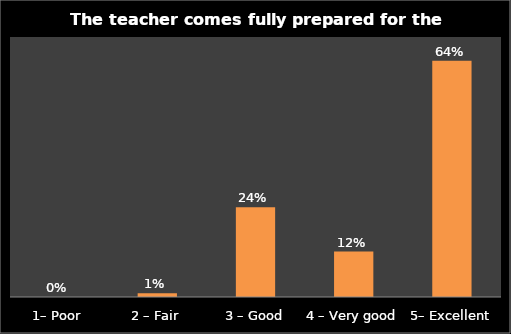
| Category | Series 0 |
|---|---|
| 1– Poor | 0 |
| 2 – Fair | 0.01 |
| 3 – Good | 0.241 |
| 4 – Very good | 0.122 |
| 5– Excellent | 0.636 |